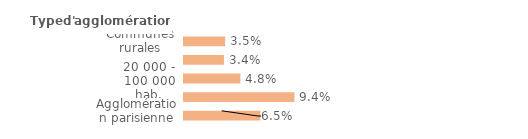
| Category | Series 0 |
|---|---|
| Communes rurales | 0.035 |
| moins de 20 000 hab. | 0.034 |
| 20 000 - 100 000 hab. | 0.048 |
| 100 000 hab. ou plus | 0.094 |
| Agglomération parisienne | 0.065 |